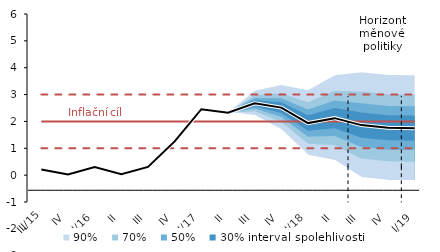
| Category | Inflation Target | Inflation Target - lower bound | Inflation Target - upper bound | linka | Střed předpovědi |
|---|---|---|---|---|---|
| III/15 | 2 | 1 | 3 | 0.212 | 0.212 |
| IV | 2 | 1 | 3 | 0.028 | 0.028 |
| I/16 | 2 | 1 | 3 | 0.305 | 0.305 |
| II | 2 | 1 | 3 | 0.039 | 0.039 |
| III | 2 | 1 | 3 | 0.305 | 0.305 |
| IV | 2 | 1 | 3 | 1.256 | 1.256 |
| I/17 | 2 | 1 | 3 | 2.455 | 2.455 |
| II | 2 | 1 | 3 | 2.327 | 2.327 |
| III | 2 | 1 | 3 | 2.673 | 2.673 |
| IV | 2 | 1 | 3 | 2.514 | 2.514 |
| I/18 | 2 | 1 | 3 | 1.939 | 1.939 |
| II | 2 | 1 | 3 | 2.122 | 2.122 |
| III | 2 | 1 | 3 | 1.864 | 1.864 |
| IV | 2 | 1 | 3 | 1.763 | 1.763 |
| I/19 | 2 | 1 | 3 | 1.749 | 1.749 |